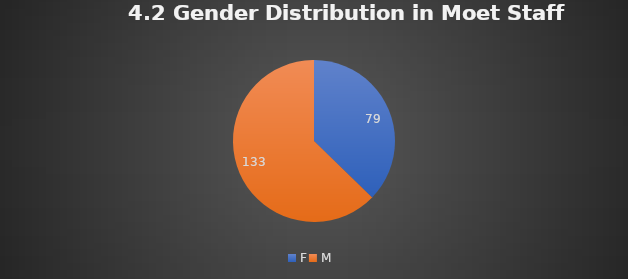
| Category | Series 0 |
|---|---|
| F | 79 |
| M  | 133 |